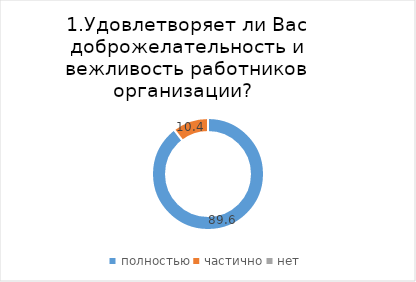
| Category | Кожевниковский |
|---|---|
| полностью | 89.63 |
| частично | 10.37 |
| нет | 0 |